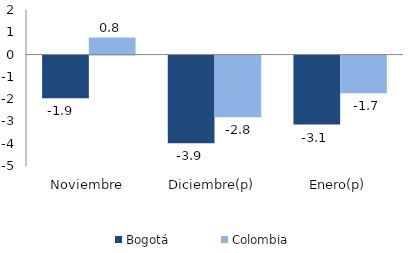
| Category | Bogotá | Colombia |
|---|---|---|
| Noviembre | -1.919 | 0.769 |
| Diciembre(p) | -3.934 | -2.77 |
| Enero(p) | -3.098 | -1.696 |